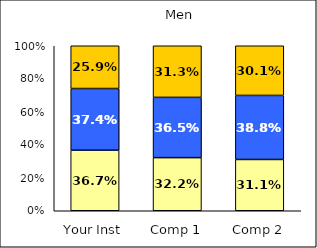
| Category | Low Social Self-Concept | Average Social Self-Concept | High Social Self-Concept |
|---|---|---|---|
| Your Inst | 0.367 | 0.374 | 0.259 |
| Comp 1 | 0.322 | 0.365 | 0.313 |
| Comp 2 | 0.311 | 0.388 | 0.301 |